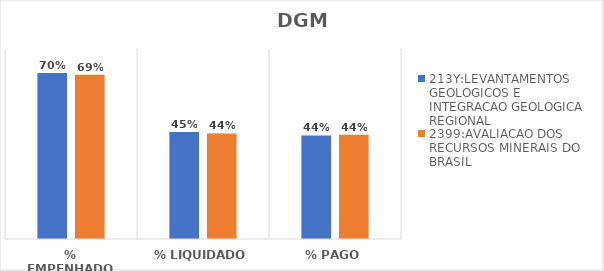
| Category | 213Y:LEVANTAMENTOS GEOLOGICOS E INTEGRACAO GEOLOGICA REGIONAL | 2399:AVALIACAO DOS RECURSOS MINERAIS DO BRASIL |
|---|---|---|
| % EMPENHADO | 0.699 | 0.692 |
| % LIQUIDADO | 0.451 | 0.444 |
| % PAGO | 0.436 | 0.439 |